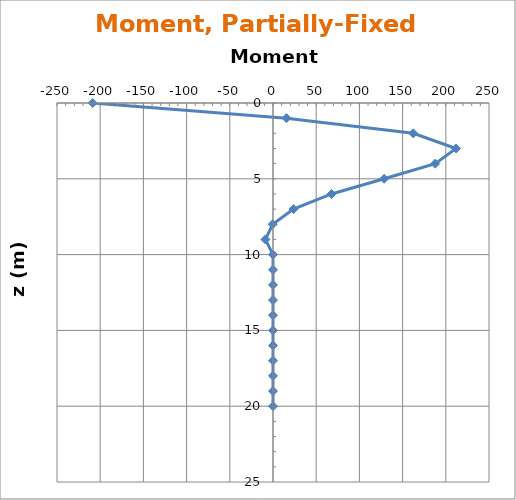
| Category | 0.5 |
|---|---|
| -208.66728654386492 | 0 |
| 15.595300159111465 | 1 |
| 162.34373846650666 | 2 |
| 211.8626980335231 | 3 |
| 187.84744655081633 | 4 |
| 128.62536257062612 | 5 |
| 67.71643138608822 | 6 |
| 23.73272396373067 | 7 |
| -0.3831410708479022 | 8 |
| -8.78055239411028 | 9 |
| 0.0 | 10 |
| 0.0 | 11 |
| 0.0 | 12 |
| 0.0 | 13 |
| 0.0 | 14 |
| 0.0 | 15 |
| 0.0 | 16 |
| 0.0 | 17 |
| 0.0 | 18 |
| 0.0 | 19 |
| 0.0 | 20 |